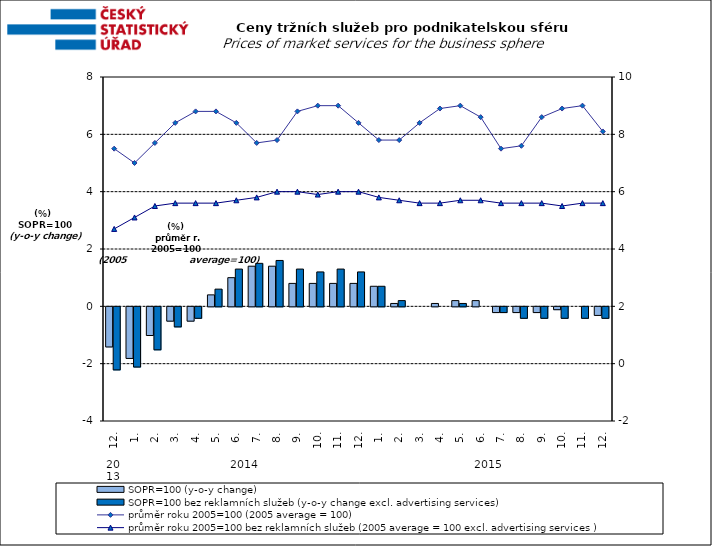
| Category | SOPR=100 (y-o-y change)   | SOPR=100 bez reklamních služeb (y-o-y change excl. advertising services)   |
|---|---|---|
| 0 | -1.4 | -2.2 |
| 1 | -1.8 | -2.1 |
| 2 | -1 | -1.5 |
| 3 | -0.5 | -0.7 |
| 4 | -0.5 | -0.4 |
| 5 | 0.4 | 0.6 |
| 6 | 1 | 1.3 |
| 7 | 1.4 | 1.5 |
| 8 | 1.4 | 1.6 |
| 9 | 0.8 | 1.3 |
| 10 | 0.8 | 1.2 |
| 11 | 0.8 | 1.3 |
| 12 | 0.8 | 1.2 |
| 13 | 0.7 | 0.7 |
| 14 | 0.1 | 0.2 |
| 15 | 0 | 0 |
| 16 | 0.1 | 0 |
| 17 | 0.2 | 0.1 |
| 18 | 0.2 | 0 |
| 19 | -0.2 | -0.2 |
| 20 | -0.2 | -0.4 |
| 21 | -0.2 | -0.4 |
| 22 | -0.1 | -0.4 |
| 23 | 0 | -0.4 |
| 24 | -0.3 | -0.4 |